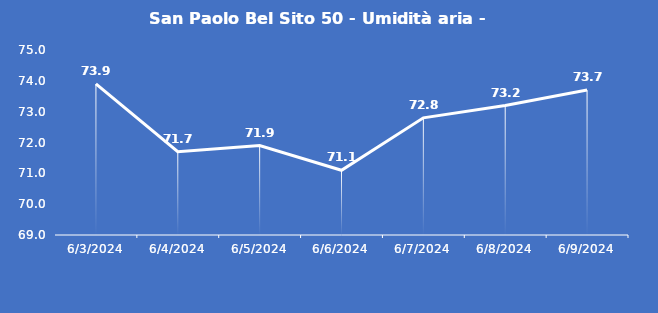
| Category | San Paolo Bel Sito 50 - Umidità aria - Grezzo (%) |
|---|---|
| 6/3/24 | 73.9 |
| 6/4/24 | 71.7 |
| 6/5/24 | 71.9 |
| 6/6/24 | 71.1 |
| 6/7/24 | 72.8 |
| 6/8/24 | 73.2 |
| 6/9/24 | 73.7 |